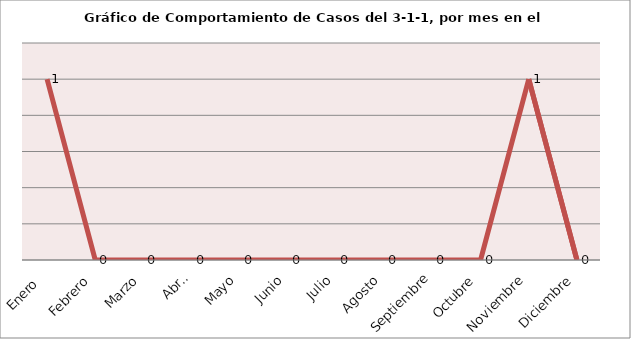
| Category | Series 0 |
|---|---|
| Enero  | 1 |
| Febrero | 0 |
| Marzo | 0 |
| Abril | 0 |
| Mayo | 0 |
| Junio | 0 |
| Julio | 0 |
| Agosto | 0 |
| Septiembre | 0 |
| Octubre | 0 |
| Noviembre | 1 |
| Diciembre | 0 |